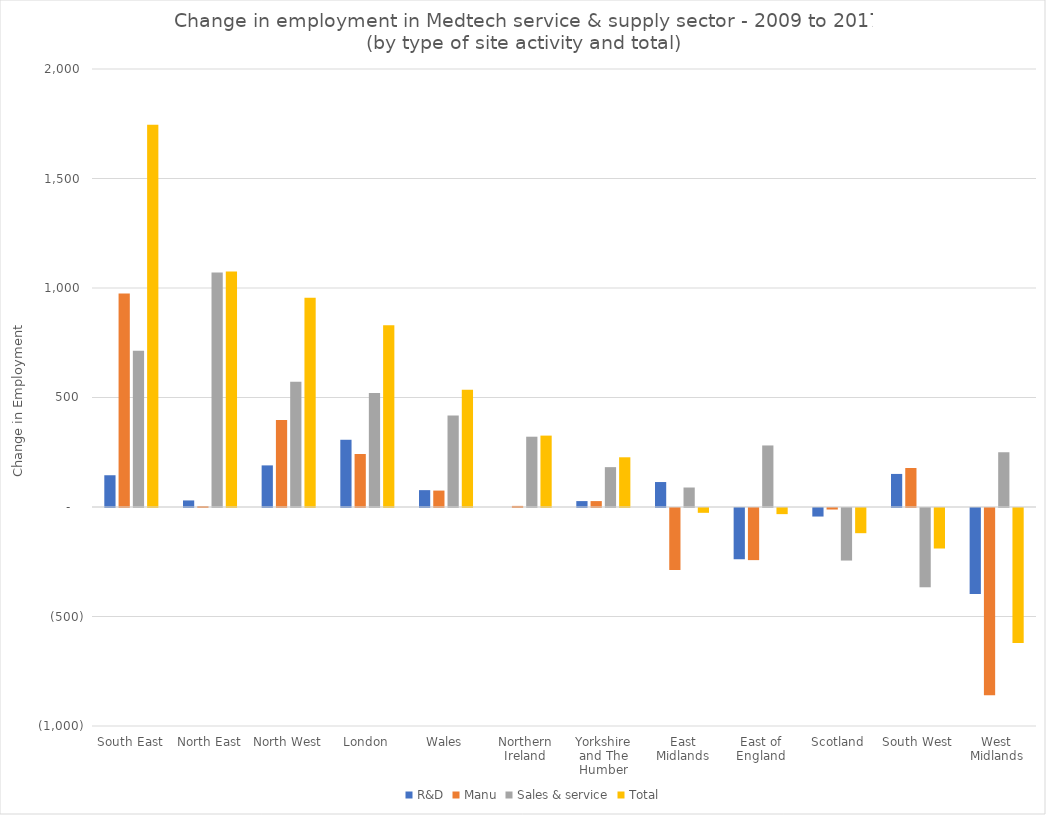
| Category | R&D | Manu | Sales & service | Total |
|---|---|---|---|---|
| South East | 145 | 975 | 713 | 1746 |
| North East | 30 | 4 | 1071 | 1075 |
| North West | 190 | 397 | 572 | 956 |
| London | 307 | 242 | 520 | 830 |
| Wales | 77 | 75 | 418 | 535 |
| Northern Ireland | 0 | 5 | 321 | 326 |
| Yorkshire and The Humber | 27 | 27 | 182 | 227 |
| East Midlands | 114 | -283 | 89 | -22 |
| East of England | -234 | -238 | 281 | -28 |
| Scotland | -39 | -7 | -240 | -115 |
| South West | 151 | 178 | -362 | -185 |
| West Midlands | -393 | -855 | 250 | -616 |